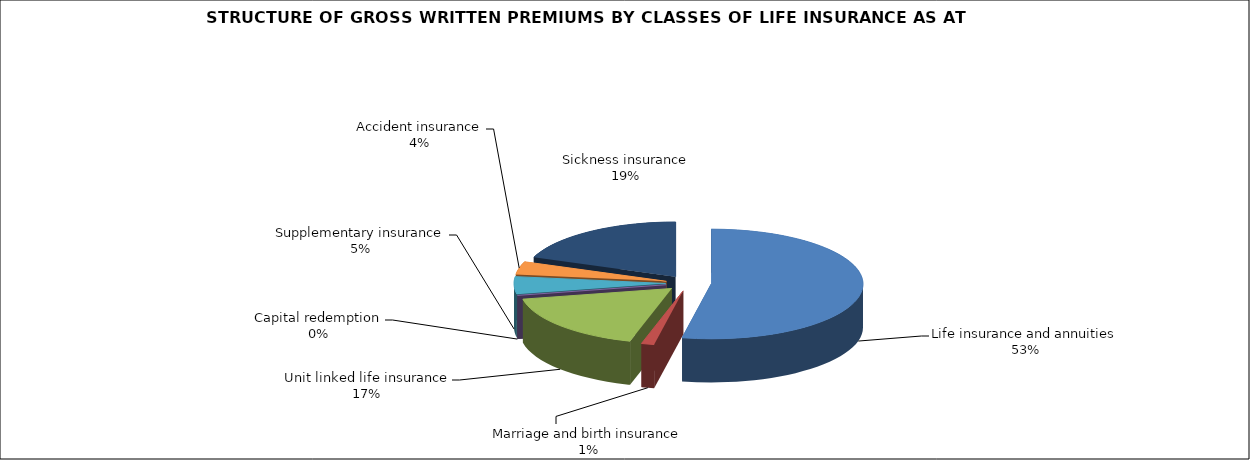
| Category | Life insurance and annuities |
|---|---|
| Life insurance and annuities | 0.531 |
| Marriage and birth insurance | 0.014 |
| Unit linked life insurance | 0.174 |
| Capital redemption | 0 |
| Supplementary insurance | 0.051 |
| Accident insurance | 0.038 |
| Sickness insurance | 0.192 |